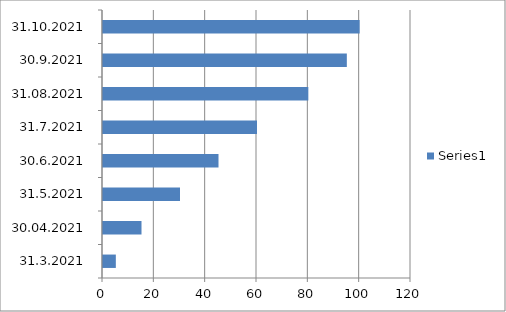
| Category | Series 0 |
|---|---|
| 31.3.2021 | 5 |
| 30.04.2021 | 15 |
| 31.5.2021 | 30 |
| 30.6.2021 | 45 |
| 31.7.2021 | 60 |
| 31.08.2021 | 80 |
| 30.9.2021 | 95 |
| 31.10.2021 | 100 |